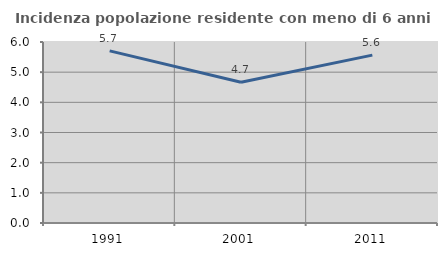
| Category | Incidenza popolazione residente con meno di 6 anni |
|---|---|
| 1991.0 | 5.706 |
| 2001.0 | 4.665 |
| 2011.0 | 5.564 |